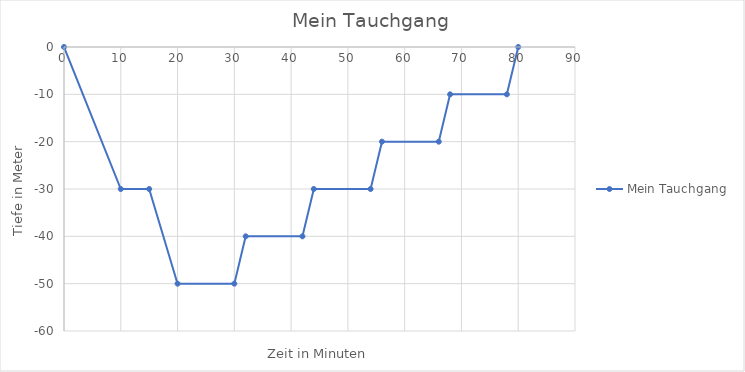
| Category | Mein Tauchgang |
|---|---|
| 0.0 | 0 |
| 10.0 | -30 |
| 15.0 | -30 |
| 20.0 | -50 |
| 30.0 | -50 |
| 32.0 | -40 |
| 42.0 | -40 |
| 44.0 | -30 |
| 54.0 | -30 |
| 56.0 | -20 |
| 66.0 | -20 |
| 68.0 | -10 |
| 78.0 | -10 |
| 80.0 | 0 |